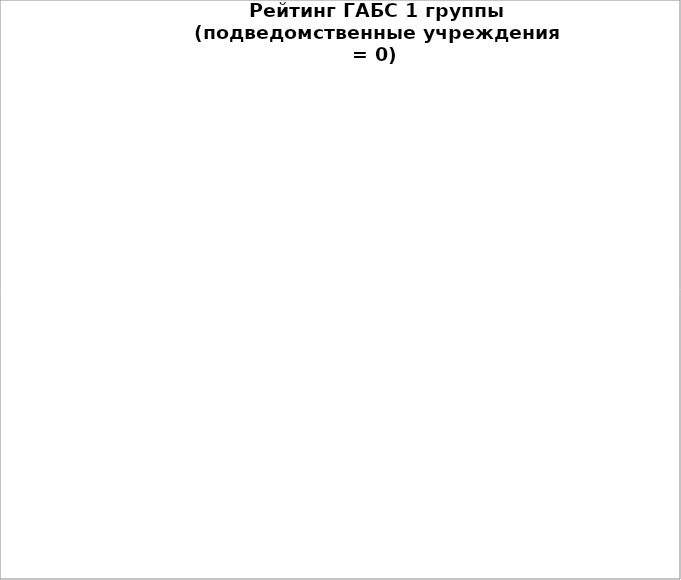
| Category | Series 0 |
|---|---|
| Департамент контрактной системы в сфере закупок Администрации города Омска | 100 |
| Департамент финансов Администрации города Омска | 100 |
| Контрольно-счетная палата города Омска | 100 |
| Омский городской Совет | 100 |
| Администрация Центрального административного округа города Омска | 100 |
| Территориальная избирательная комиссия по Ленинскому административному округу города Омска Омской области | 100 |
| Администрация Кировского административного округа города Омска | 97.527 |
| Департамент строительства Администрации города Омска | 96.684 |
| Администрация Советского административного округа города Омска | 95.055 |
| Администрация Ленинского административного округа города Омска | 92.033 |
| Администрация Октябрьского административного округа города Омска | 91.758 |
| Департамент транспорта Администрации города Омска | 90.568 |